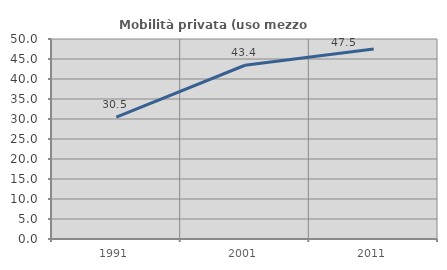
| Category | Mobilità privata (uso mezzo privato) |
|---|---|
| 1991.0 | 30.482 |
| 2001.0 | 43.438 |
| 2011.0 | 47.472 |